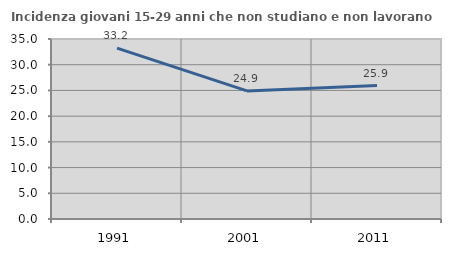
| Category | Incidenza giovani 15-29 anni che non studiano e non lavorano  |
|---|---|
| 1991.0 | 33.218 |
| 2001.0 | 24.907 |
| 2011.0 | 25.937 |